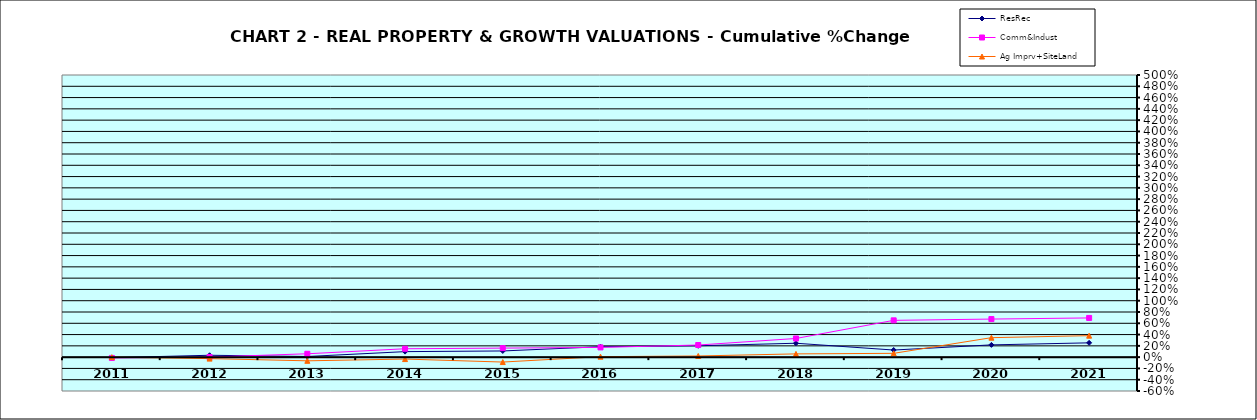
| Category | ResRec | Comm&Indust | Ag Imprv+SiteLand |
|---|---|---|---|
| 2011.0 | -0.01 | -0.014 | 0 |
| 2012.0 | 0.033 | 0.001 | -0.026 |
| 2013.0 | 0.012 | 0.06 | -0.065 |
| 2014.0 | 0.098 | 0.148 | -0.034 |
| 2015.0 | 0.11 | 0.16 | -0.087 |
| 2016.0 | 0.185 | 0.173 | 0.008 |
| 2017.0 | 0.202 | 0.215 | 0.021 |
| 2018.0 | 0.246 | 0.331 | 0.058 |
| 2019.0 | 0.126 | 0.652 | 0.067 |
| 2020.0 | 0.217 | 0.675 | 0.345 |
| 2021.0 | 0.254 | 0.695 | 0.381 |